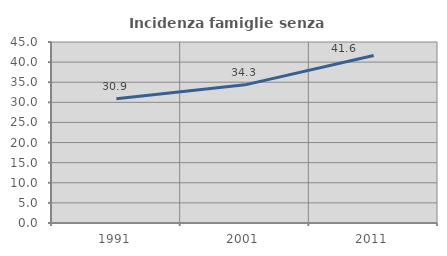
| Category | Incidenza famiglie senza nuclei |
|---|---|
| 1991.0 | 30.905 |
| 2001.0 | 34.343 |
| 2011.0 | 41.643 |